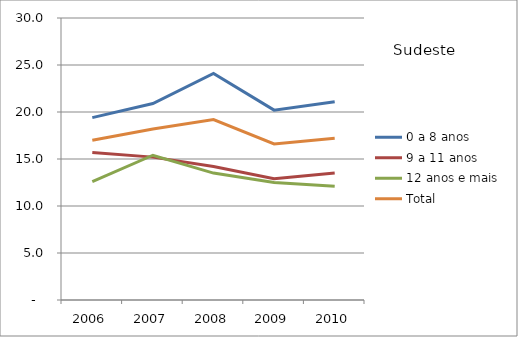
| Category | 0 a 8 anos | 9 a 11 anos | 12 anos e mais | Total |
|---|---|---|---|---|
| 2006.0 | 19.4 | 15.7 | 12.6 | 17 |
| 2007.0 | 20.9 | 15.2 | 15.4 | 18.2 |
| 2008.0 | 24.1 | 14.2 | 13.5 | 19.2 |
| 2009.0 | 20.2 | 12.9 | 12.5 | 16.6 |
| 2010.0 | 21.1 | 13.5 | 12.1 | 17.2 |